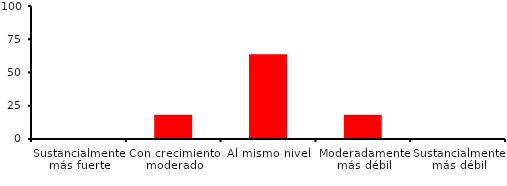
| Category | Series 0 |
|---|---|
| Sustancialmente más fuerte | 0 |
| Con crecimiento moderado | 18.182 |
| Al mismo nivel | 63.636 |
| Moderadamente más débil | 18.182 |
| Sustancialmente más débil | 0 |